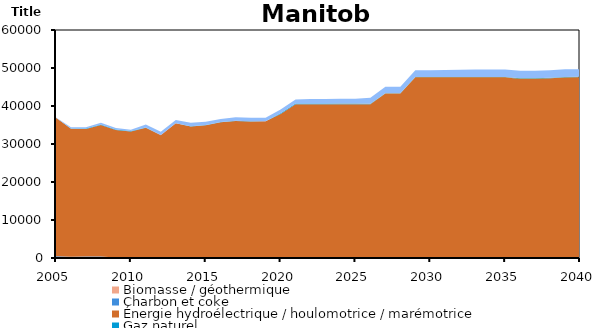
| Category | Biomasse / géothermique | Charbon et coke | Énergie hydroélectrique / houlomotrice / marémotrice | Gaz naturel | Pétrole | Solaire | Uranium | Éolien |
|---|---|---|---|---|---|---|---|---|
| 2005.0 | 27.33 | 413.257 | 36440 | 41.65 | 8.292 | 0 | 0 | 53 |
| 2006.0 | 32 | 316.984 | 33651 | 90.765 | 7.351 | 0 | 0 | 325 |
| 2007.0 | 27 | 380.97 | 33513 | 172.591 | 10.639 | 0 | 0 | 325 |
| 2008.0 | 38 | 380.185 | 34588 | 133.662 | 9.453 | 0 | 0 | 412 |
| 2009.0 | 0 | 137.785 | 33549 | 129.408 | 4.706 | 0 | 0 | 365 |
| 2010.0 | 0 | 43.573 | 33269 | 98.953 | 2.374 | 0 | 0 | 343 |
| 2011.0 | 0 | 48.774 | 34206 | 109.297 | 3.529 | 0 | 0 | 747 |
| 2012.0 | 39 | 50.541 | 32185 | 60.696 | 2.651 | 0 | 0 | 877 |
| 2013.0 | 42 | 64.182 | 35337 | 30.494 | 1.935 | 0 | 0 | 868 |
| 2014.0 | 64.4 | 67.617 | 34494.88 | 32.091 | 6.792 | 0 | 0 | 911.319 |
| 2015.0 | 72.6 | 83.711 | 34773.94 | 54.426 | 3.876 | 0 | 0 | 845.792 |
| 2016.0 | 86.9 | 42.199 | 35599.45 | 33.838 | 2.578 | 0 | 0 | 807.859 |
| 2017.0 | 56.3 | 29.245 | 35990.53 | 26.465 | 1.897 | 0 | 0 | 941.594 |
| 2018.0 | 56.3 | 29.245 | 35826.16 | 68.398 | 1.088 | 0 | 0 | 941.593 |
| 2019.0 | 56.3 | 29.245 | 35878.98 | 6.849 | 1.088 | 6.132 | 0 | 941.594 |
| 2020.0 | 56.3 | 0 | 37869.29 | 163.132 | 0.529 | 24.332 | 0 | 934.067 |
| 2021.0 | 56.3 | 0 | 40423.93 | 163.176 | 0.533 | 25.404 | 0 | 1046.714 |
| 2022.0 | 56.3 | 0 | 40423.97 | 163.176 | 0.533 | 26.28 | 0 | 1151.834 |
| 2023.0 | 56.3 | 0 | 40423.98 | 163.176 | 0.533 | 27.156 | 0 | 1151.834 |
| 2024.0 | 56.3 | 0 | 40423.95 | 115.742 | 0.533 | 45.552 | 0 | 1256.954 |
| 2025.0 | 56.3 | 0 | 40423.96 | 115.742 | 0.533 | 46.428 | 0 | 1256.953 |
| 2026.0 | 56.3 | 0 | 40423.98 | 43.015 | 0.533 | 47.304 | 0 | 1572.314 |
| 2027.0 | 56.3 | 0 | 43223.97 | 37.118 | 0.533 | 48.18 | 0 | 1677.434 |
| 2028.0 | 56.3 | 0 | 43223.95 | 37.118 | 0.533 | 66.576 | 0 | 1677.434 |
| 2029.0 | 56.3 | 0 | 47483.19 | 11.425 | 0.533 | 67.452 | 0 | 1782.554 |
| 2030.0 | 56.3 | 0 | 47483.18 | 5.496 | 0.533 | 68.328 | 0 | 1782.555 |
| 2031.0 | 56.3 | 0 | 47483.18 | 5.496 | 0.533 | 69.204 | 0 | 1887.674 |
| 2032.0 | 56.3 | 0 | 47483.16 | 5.496 | 0.533 | 87.6 | 0 | 1887.675 |
| 2033.0 | 56.3 | 0 | 47483.17 | 5.496 | 0.533 | 88.476 | 0 | 1992.794 |
| 2034.0 | 56.3 | 0 | 47483.17 | 5.496 | 0.533 | 89.352 | 0 | 1992.794 |
| 2035.0 | 56.3 | 0 | 47483.17 | 5.496 | 0.533 | 90.228 | 0 | 1992.794 |
| 2036.0 | 56.3 | 0 | 47076.35 | 43.015 | 0.533 | 108.624 | 0 | 1992.795 |
| 2037.0 | 56.3 | 0 | 47076.35 | 48.912 | 0.533 | 109.5 | 0 | 1992.795 |
| 2038.0 | 56.3 | 0 | 47236.24 | 43.015 | 0.533 | 110.376 | 0 | 1992.795 |
| 2039.0 | 56.3 | 0 | 47445.84 | 43.308 | 0.533 | 111.252 | 0 | 1992.795 |
| 2040.0 | 56.3 | 0 | 47483.18 | 45.492 | 0.533 | 128.772 | 0 | 1992.795 |